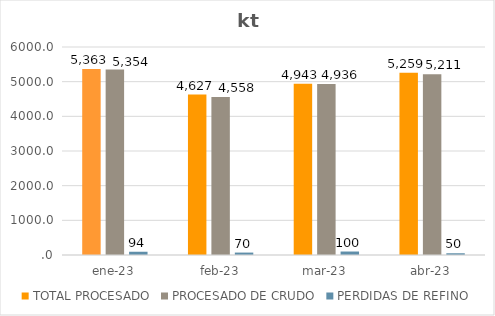
| Category | TOTAL PROCESADO | PROCESADO DE CRUDO | PERDIDAS DE REFINO |
|---|---|---|---|
| ene-23 | 5363.26 | 5354.203 | 93.925 |
| feb-23 | 4626.754 | 4557.777 | 69.941 |
| mar-23 | 4942.759 | 4935.575 | 100.422 |
| abr-23 | 5258.757 | 5211.417 | 50.176 |